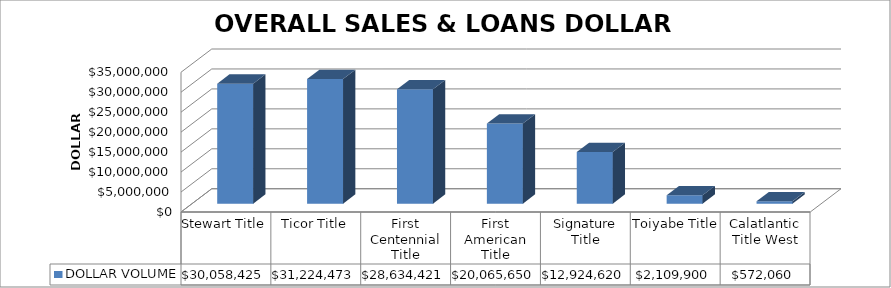
| Category | DOLLAR VOLUME |
|---|---|
| Stewart Title | 30058425 |
| Ticor Title | 31224473 |
| First Centennial Title | 28634421 |
| First American Title | 20065650 |
| Signature Title | 12924620 |
| Toiyabe Title | 2109900 |
| Calatlantic Title West | 572060 |